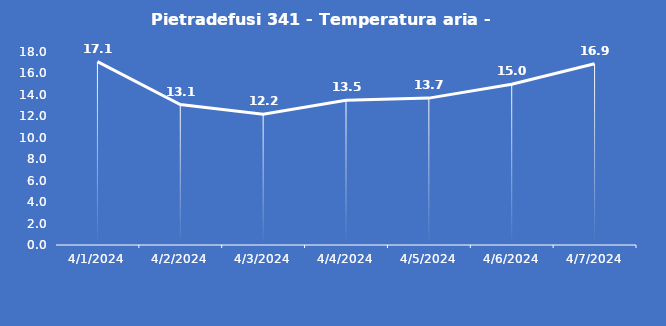
| Category | Pietradefusi 341 - Temperatura aria - Grezzo (°C) |
|---|---|
| 4/1/24 | 17.1 |
| 4/2/24 | 13.1 |
| 4/3/24 | 12.2 |
| 4/4/24 | 13.5 |
| 4/5/24 | 13.7 |
| 4/6/24 | 15 |
| 4/7/24 | 16.9 |